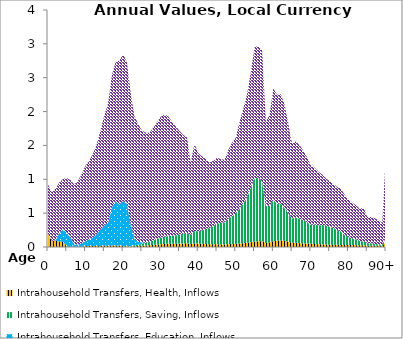
| Category | Intrahousehold Transfers, Health, Inflows | Intrahousehold Transfers, Saving, Inflows | Intrahousehold Transfers, Education, Inflows | Intrahousehold Transfers, Consumption other than health and education, Inflows |
|---|---|---|---|---|
| 0 | 198.182 | 0 | 0 | 726.409 |
|  | 91.339 | 0 | 0 | 714.878 |
| 2 | 98.154 | 0 | 0 | 765.526 |
| 3 | 81.037 | 0 | 119.677 | 752.321 |
| 4 | 80.945 | 0 | 185.393 | 739.192 |
| 5 | 4.7 | 0 | 202.073 | 812.313 |
| 6 | 4.422 | 0 | 129.217 | 854.797 |
| 7 | 4.48 | 0 | 32.789 | 886.714 |
| 8 | 4.613 | 0 | 33.347 | 941.258 |
| 9 | 4.339 | 0 | 45.006 | 1032.443 |
| 10 | 12.773 | 0 | 70.472 | 1120.046 |
| 11 | 14.158 | 0 | 103.666 | 1161.541 |
| 12 | 13.527 | 0 | 128.373 | 1236.514 |
| 13 | 13.048 | 0 | 176.331 | 1335.91 |
| 14 | 15.46 | 0 | 240.441 | 1466.881 |
| 15 | 20.584 | 0 | 296.937 | 1628.792 |
| 16 | 19.901 | 0 | 335.213 | 1768.685 |
| 17 | 21.493 | 0 | 564.004 | 1946.662 |
| 18 | 21.003 | 0 | 657.776 | 2057.209 |
| 19 | 21.918 | 0 | 600.872 | 2131.788 |
| 20 | 13.282 | 2.128 | 663.811 | 2165.583 |
| 21 | 9.967 | 5.839 | 625.549 | 2087.568 |
| 22 | 6.122 | 10.312 | 323.277 | 1944.228 |
| 23 | 10.109 | 14.998 | 96.375 | 1816.733 |
| 24 | 13.996 | 19.935 | 42.217 | 1742.868 |
| 25 | 18.389 | 29.206 | 18.789 | 1654.264 |
| 26 | 21.852 | 38.592 | 1.492 | 1627.149 |
| 27 | 26.181 | 49.236 | 4.868 | 1604.885 |
| 28 | 30.715 | 66.255 | 0.967 | 1662.189 |
| 29 | 34.548 | 85.323 | 0.083 | 1719.043 |
| 30 | 40.233 | 96.705 | 1.908 | 1785.595 |
| 31 | 45.395 | 105.213 | 0 | 1808.961 |
| 32 | 47.822 | 114.639 | 1.472 | 1767.613 |
| 33 | 48.106 | 120.9 | 0.272 | 1682.406 |
| 34 | 49.667 | 122.024 | 0.769 | 1610.331 |
| 35 | 49.387 | 136.604 | 0 | 1530.932 |
| 36 | 51.507 | 147.207 | 0.243 | 1456.41 |
| 37 | 55.365 | 157.154 | 0.094 | 1408.379 |
| 38 | 42.88 | 133.068 | 0 | 1069.461 |
| 39 | 53.42 | 181.566 | 0 | 1289.239 |
| 40 | 48.966 | 182.471 | 0 | 1156.893 |
| 41 | 47.221 | 198.596 | 0 | 1093.224 |
| 42 | 43.368 | 224.558 | 0 | 1030.585 |
| 43 | 40.753 | 237.389 | 0 | 970.196 |
| 44 | 40.129 | 268.414 | 0 | 963.81 |
| 45 | 41.386 | 302.636 | 0.136 | 972.837 |
| 46 | 38.271 | 321.444 | 0 | 939.987 |
| 47 | 36.875 | 324.662 | 0 | 925.923 |
| 48 | 41.206 | 374.321 | 0 | 1015.276 |
| 49 | 43.426 | 411.941 | 0 | 1083.662 |
| 50 | 45.883 | 444.461 | 0 | 1125.236 |
| 51 | 51.158 | 519.058 | 1.647 | 1279.113 |
| 52 | 55.562 | 590.019 | 0.17 | 1395.376 |
| 53 | 61.319 | 672.448 | 0.011 | 1519.912 |
| 54 | 70.564 | 807.382 | 0 | 1699.843 |
| 55 | 78.825 | 932.313 | 0 | 1938.5 |
| 56 | 83.27 | 943 | 0 | 1943.588 |
| 57 | 86.516 | 879.348 | 0 | 1943.687 |
| 58 | 59.085 | 544.433 | 0.108 | 1251.51 |
| 59 | 67.316 | 542.002 | 0 | 1346.991 |
| 60 | 87.68 | 607.63 | 0 | 1644.846 |
| 61 | 90.934 | 548.312 | 0 | 1610.741 |
| 62 | 96.349 | 545.063 | 0 | 1615.193 |
| 63 | 91.237 | 480.802 | 0 | 1530.675 |
| 64 | 77.242 | 418.378 | 0 | 1320.441 |
| 65 | 62.708 | 361.578 | 0 | 1097.959 |
| 66 | 62.056 | 370.802 | 0.006 | 1127.219 |
| 67 | 56.918 | 359.356 | 0.01 | 1087.825 |
| 68 | 52.29 | 344.182 | 0 | 1022.911 |
| 69 | 50.466 | 314.884 | 0 | 959.528 |
| 70 | 46.956 | 282.2 | 0 | 877.748 |
| 71 | 43.23 | 287.549 | 0 | 840.508 |
| 72 | 40.981 | 279.091 | 0 | 795.581 |
| 73 | 39.131 | 284.674 | 0 | 746.657 |
| 74 | 35.388 | 285.828 | 0 | 693.824 |
| 75 | 33.374 | 263.985 | 0 | 673.954 |
| 76 | 32.986 | 247.561 | 0 | 647.371 |
| 77 | 31.651 | 220.489 | 0 | 637.211 |
| 78 | 30.729 | 196.093 | 0 | 634.114 |
| 79 | 29.65 | 146.087 | 0 | 594.549 |
| 80 | 29.335 | 116.26 | 0 | 560.54 |
| 81 | 28.386 | 95.21 | 0 | 531.71 |
| 82 | 27.181 | 86.2 | 0 | 502.91 |
| 83 | 26.276 | 64.492 | 0 | 476.032 |
| 84 | 26.264 | 56.411 | 0 | 496.464 |
| 85 | 19.232 | 37.898 | 0 | 388.776 |
| 86 | 18.842 | 35.38 | 0 | 389.711 |
| 87 | 18.608 | 27 | 0 | 379.419 |
| 88 | 18.2 | 21.974 | 0 | 357.325 |
| 89 | 17.396 | 17.972 | 0 | 320.521 |
| 90+ | 72.911 | 64.992 | 0 | 1271.788 |